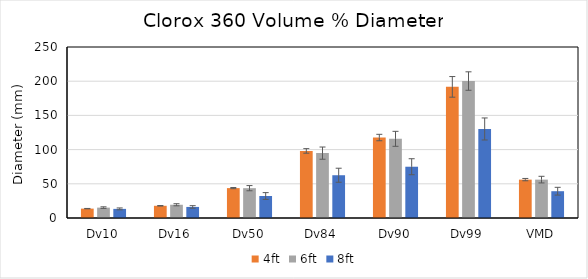
| Category | 4ft | 6ft | 8ft |
|---|---|---|---|
| Dv10 | 13.704 | 15.187 | 13.325 |
| Dv16 | 17.851 | 19.363 | 16.183 |
| Dv50 | 43.698 | 43.59 | 32.177 |
| Dv84 | 98.086 | 94.849 | 62.526 |
| Dv90 | 117.636 | 115.751 | 74.961 |
| Dv99 | 191.712 | 200.23 | 130.146 |
| VMD | 56.107 | 56.098 | 39.17 |